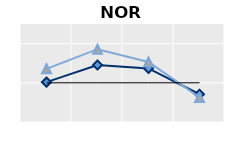
| Category | Né à l'étranger | Né dans le pays | Series 1 |
|---|---|---|---|
| 15-24 | 1.018 | 1.357 | 1 |
| 25-54 | 1.452 | 1.858 | 1 |
| 55-64 | 1.366 | 1.532 | 1 |
| 65+ | 0.708 | 0.627 | 1 |